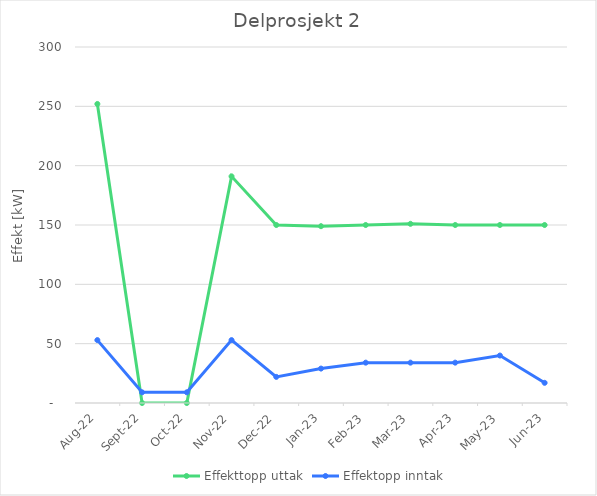
| Category | Effekttopp uttak | Effektopp inntak |
|---|---|---|
| 2022-08-01 | 252 | 53 |
| 2022-09-01 | 0 | 9 |
| 2022-10-01 | 0 | 9 |
| 2022-11-01 | 191 | 53 |
| 2022-12-01 | 150 | 22 |
| 2023-01-01 | 149 | 29 |
| 2023-02-01 | 150 | 34 |
| 2023-03-01 | 151 | 34 |
| 2023-04-01 | 150 | 34 |
| 2023-05-01 | 150 | 40 |
| 2023-06-01 | 150 | 17 |